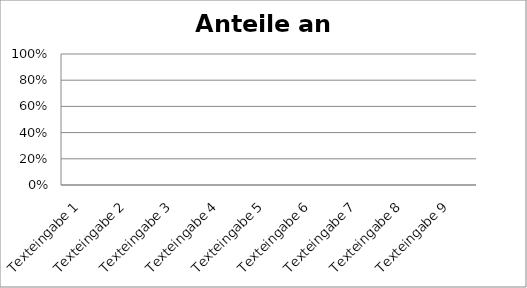
| Category | Series 0 |
|---|---|
| Texteingabe 1 | 0 |
| Texteingabe 2 | 0 |
| Texteingabe 3 | 0 |
| Texteingabe 4 | 0 |
| Texteingabe 5 | 0 |
| Texteingabe 6 | 0 |
| Texteingabe 7 | 0 |
| Texteingabe 8 | 0 |
| Texteingabe 9 | 0 |